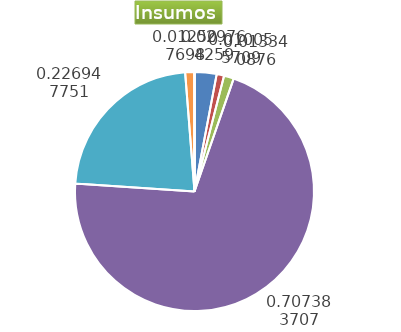
| Category | Series 0 |
|---|---|
| Control arvenses | 483550 |
| Control fitosanitario | 163365 |
| Cosecha y beneficio | 216735.796 |
| Fertilización | 11492152 |
| Instalación | 3686991.966 |
| Otros | 203200 |
| Podas | 0 |
| Riego | 0 |
| Transporte | 0 |
| Tutorado | 0 |